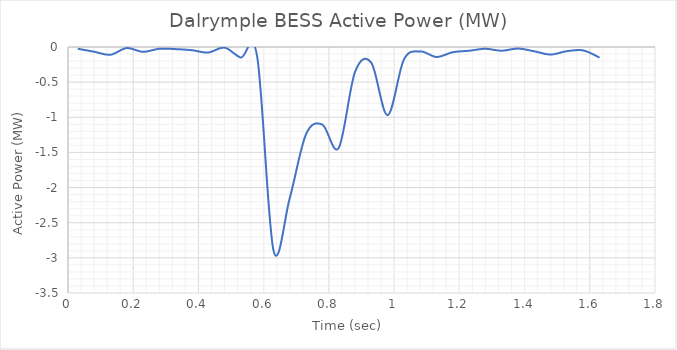
| Category | Active Power (MW) |
|---|---|
| 0.03 | -0.025 |
| 0.08 | -0.067 |
| 0.13 | -0.11 |
| 0.18 | -0.015 |
| 0.23 | -0.069 |
| 0.28 | -0.025 |
| 0.33 | -0.03 |
| 0.38 | -0.046 |
| 0.43 | -0.079 |
| 0.48 | -0.009 |
| 0.53 | -0.15 |
| 0.58 | -0.134 |
| 0.63 | -2.89 |
| 0.68 | -2.149 |
| 0.73 | -1.24 |
| 0.78 | -1.104 |
| 0.83 | -1.437 |
| 0.88 | -0.357 |
| 0.93 | -0.223 |
| 0.98 | -0.97 |
| 1.03 | -0.178 |
| 1.08 | -0.063 |
| 1.13 | -0.142 |
| 1.18 | -0.074 |
| 1.23 | -0.053 |
| 1.28 | -0.025 |
| 1.33 | -0.053 |
| 1.38 | -0.022 |
| 1.43 | -0.062 |
| 1.48 | -0.107 |
| 1.53 | -0.059 |
| 1.58 | -0.049 |
| 1.63 | -0.151 |